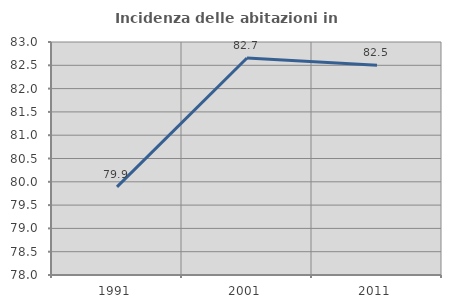
| Category | Incidenza delle abitazioni in proprietà  |
|---|---|
| 1991.0 | 79.892 |
| 2001.0 | 82.657 |
| 2011.0 | 82.501 |